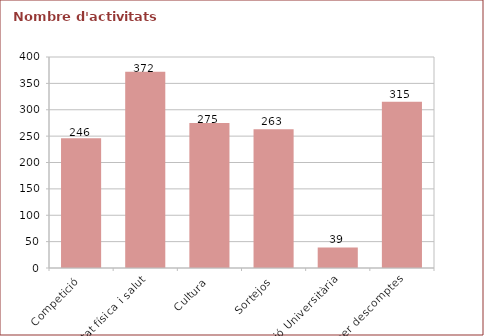
| Category | Nombre d'activitats ofertades |
|---|---|
| Competició | 246 |
| Activitat física i salut | 372 |
| Cultura | 275 |
| Sortejos | 263 |
| Extensió Universitària | 39 |
| Acords per descomptes | 315 |